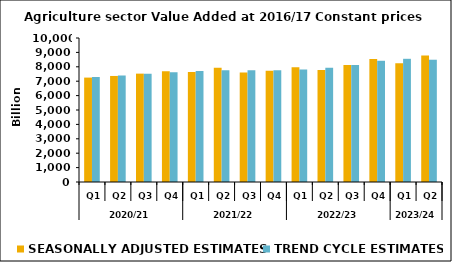
| Category | SEASONALLY ADJUSTED ESTIMATES | TREND CYCLE ESTIMATES |
|---|---|---|
| 0 | 7250.317 | 7293.356 |
| 1 | 7363.661 | 7389.084 |
| 2 | 7525.578 | 7525.752 |
| 3 | 7684.312 | 7625.231 |
| 4 | 7632.47 | 7713.987 |
| 5 | 7932.307 | 7764.878 |
| 6 | 7611.787 | 7756.794 |
| 7 | 7725.178 | 7761.188 |
| 8 | 7968.856 | 7808.525 |
| 9 | 7781.039 | 7928.253 |
| 10 | 8120.604 | 8131.108 |
| 11 | 8548.571 | 8418.355 |
| 12 | 8253.513 | 8555.372 |
| 13 | 8778.909 | 8491.183 |